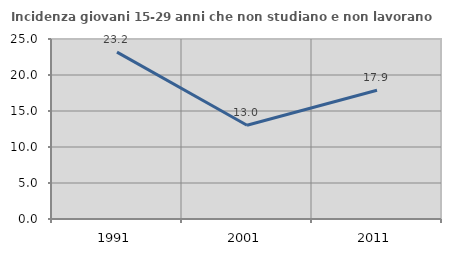
| Category | Incidenza giovani 15-29 anni che non studiano e non lavorano  |
|---|---|
| 1991.0 | 23.183 |
| 2001.0 | 13.027 |
| 2011.0 | 17.88 |